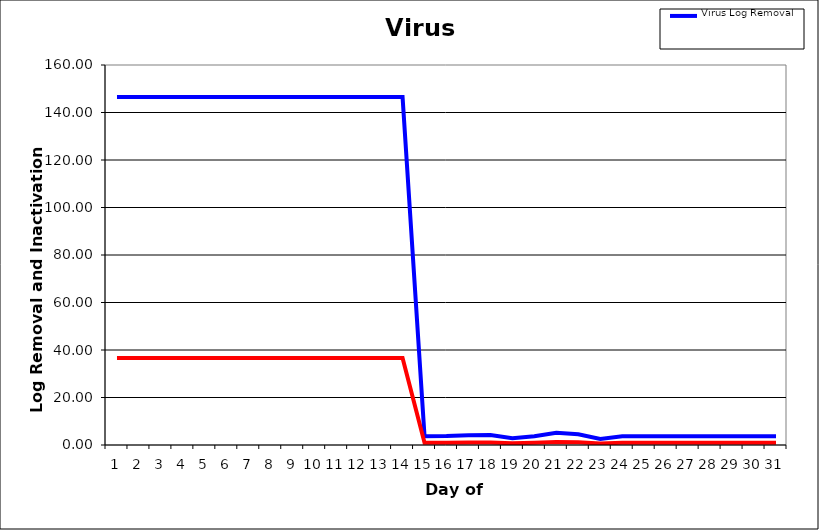
| Category | Virus Log Removal | Virus Inactivation Ratio |
|---|---|---|
| 1.0 | 146.496 | 36.624 |
| 2.0 | 146.496 | 36.624 |
| 3.0 | 146.496 | 36.624 |
| 4.0 | 146.496 | 36.624 |
| 5.0 | 146.496 | 36.624 |
| 6.0 | 146.496 | 36.624 |
| 7.0 | 146.496 | 36.624 |
| 8.0 | 146.496 | 36.624 |
| 9.0 | 146.496 | 36.624 |
| 10.0 | 146.496 | 36.624 |
| 11.0 | 146.496 | 36.624 |
| 12.0 | 146.496 | 36.624 |
| 13.0 | 146.496 | 36.624 |
| 14.0 | 146.496 | 36.624 |
| 15.0 | 3.727 | 0.932 |
| 16.0 | 3.812 | 0.953 |
| 17.0 | 4.122 | 1.031 |
| 18.0 | 4.231 | 1.058 |
| 19.0 | 2.885 | 0.721 |
| 20.0 | 3.706 | 0.926 |
| 21.0 | 5.175 | 1.294 |
| 22.0 | 4.501 | 1.125 |
| 23.0 | 2.566 | 0.641 |
| 24.0 | 3.727 | 0.932 |
| 25.0 | 3.727 | 0.932 |
| 26.0 | 3.727 | 0.932 |
| 27.0 | 3.727 | 0.932 |
| 28.0 | 3.727 | 0.932 |
| 29.0 | 3.727 | 0.932 |
| 30.0 | 3.727 | 0.932 |
| 31.0 | 3.727 | 0.932 |